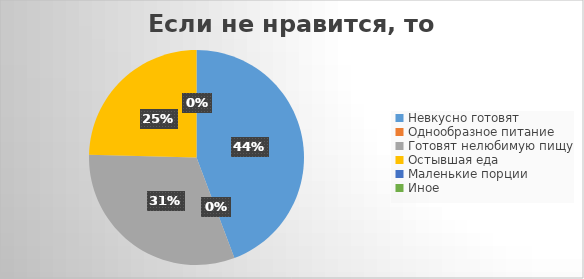
| Category | Series 0 |
|---|---|
| Невкусно готовят | 27 |
| Однообразное питание | 0 |
| Готовят нелюбимую пищу | 19 |
| Остывшая еда | 15 |
| Маленькие порции | 0 |
| Иное | 0 |